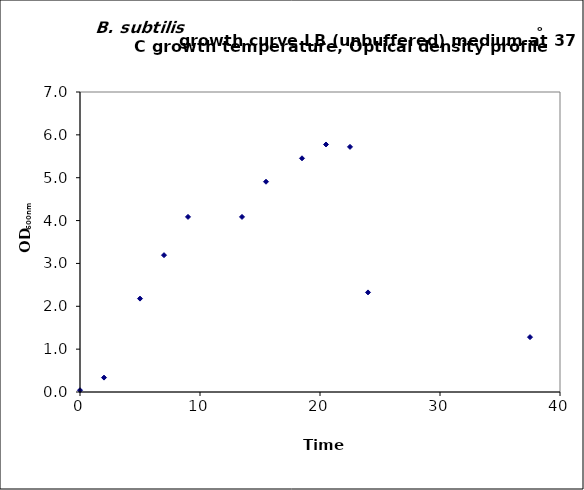
| Category | Series 0 |
|---|---|
| 0.0 | 0.041 |
| 2.0 | 0.336 |
| 5.0 | 2.179 |
| 7.0 | 3.193 |
| 9.0 | 4.086 |
| 13.5 | 4.085 |
| 15.5 | 4.906 |
| 18.5 | 5.453 |
| 20.5 | 5.776 |
| 22.5 | 5.719 |
| 24.0 | 2.324 |
| 37.5 | 1.28 |